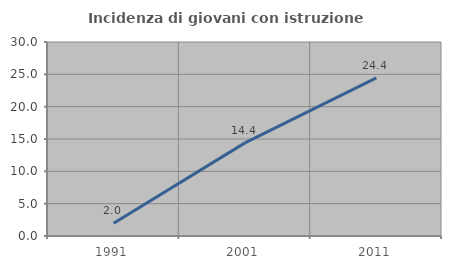
| Category | Incidenza di giovani con istruzione universitaria |
|---|---|
| 1991.0 | 1.961 |
| 2001.0 | 14.4 |
| 2011.0 | 24.444 |